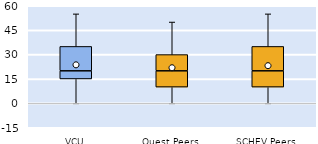
| Category | 25th | 50th | 75th |
|---|---|---|---|
| VCU | 15 | 5 | 15 |
| Quest Peers | 10 | 10 | 10 |
| SCHEV Peers | 10 | 10 | 15 |